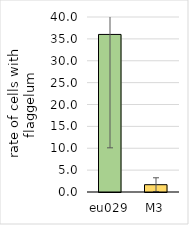
| Category | Series 0 |
|---|---|
| eu029 | 36.016 |
| M3 | 1.668 |